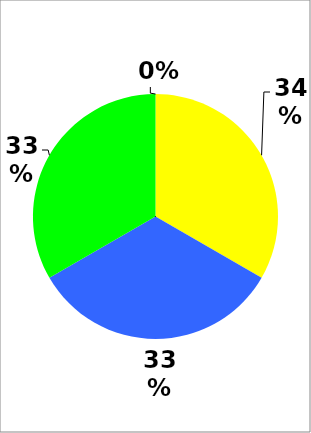
| Category | Series 0 |
|---|---|
| R | 0 |
| Y | 1 |
| B | 1 |
| G | 1 |